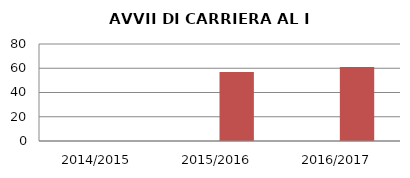
| Category | ANNO | NUMERO |
|---|---|---|
| 2014/2015 | 0 | 0 |
| 2015/2016 | 0 | 57 |
| 2016/2017 | 0 | 61 |